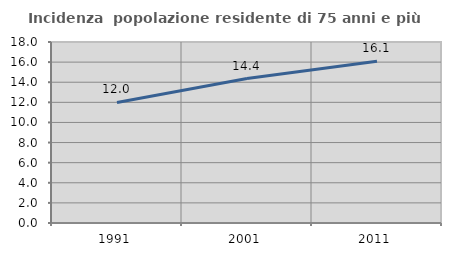
| Category | Incidenza  popolazione residente di 75 anni e più |
|---|---|
| 1991.0 | 11.986 |
| 2001.0 | 14.367 |
| 2011.0 | 16.077 |